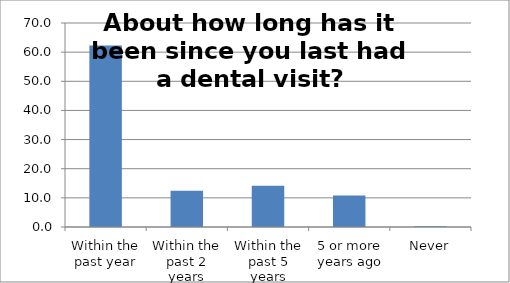
| Category | Series 0 |
|---|---|
| Within the past year | 62.296 |
| Within the past 2 years | 12.398 |
| Within the past 5 years | 14.181 |
| 5 or more years ago | 10.845 |
| Never | 0.28 |